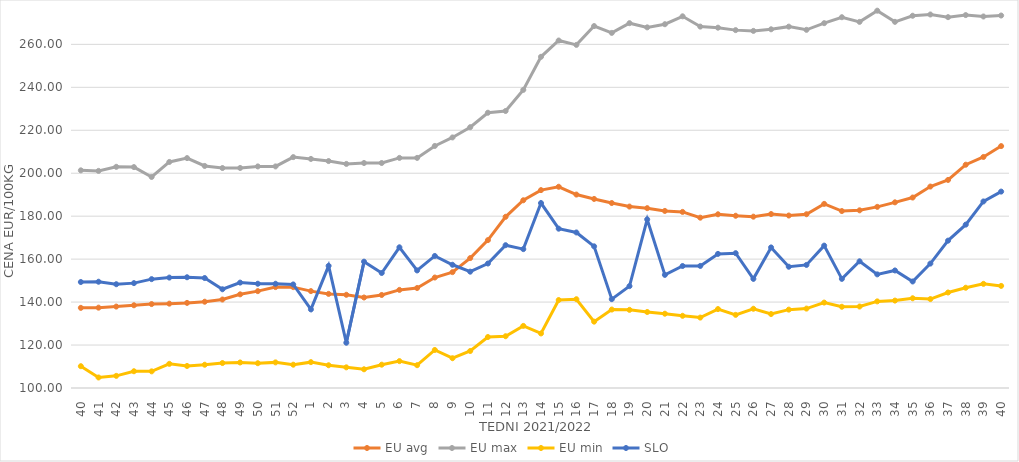
| Category | EU avg | EU max | EU min | SLO |
|---|---|---|---|---|
| 40.0 | 137.315 | 201.34 | 110.15 | 149.34 |
| 41.0 | 137.411 | 201.081 | 104.9 | 149.48 |
| 42.0 | 137.908 | 202.98 | 105.65 | 148.32 |
| 43.0 | 138.52 | 202.856 | 107.8 | 148.83 |
| 44.0 | 139.076 | 198.26 | 107.75 | 150.69 |
| 45.0 | 139.275 | 205.257 | 111.25 | 151.41 |
| 46.0 | 139.626 | 207.046 | 110.26 | 151.56 |
| 47.0 | 140.17 | 203.387 | 110.83 | 151.2 |
| 48.0 | 141.2 | 202.42 | 111.62 | 145.97 |
| 49.0 | 143.614 | 202.45 | 111.89 | 149.07 |
| 50.0 | 145.101 | 203.17 | 111.54 | 148.55 |
| 51.0 | 146.984 | 203.17 | 111.93 | 148.54 |
| 52.0 | 146.958 | 207.5 | 110.85 | 148.22 |
| 1.0 | 145.11 | 206.66 | 112.04 | 136.59 |
| 2.0 | 143.822 | 205.67 | 110.59 | 156.88 |
| 3.0 | 143.402 | 204.34 | 109.62 | 121.07 |
| 4.0 | 142.134 | 204.76 | 108.71 | 158.82 |
| 5.0 | 143.314 | 204.76 | 110.86 | 153.55 |
| 6.0 | 145.677 | 207.14 | 112.52 | 165.51 |
| 7.0 | 146.556 | 207.14 | 110.619 | 154.74 |
| 8.0 | 151.439 | 212.7 | 117.709 | 161.48 |
| 9.0 | 153.947 | 216.67 | 113.871 | 157.38 |
| 10.0 | 160.496 | 221.43 | 117.233 | 154.16 |
| 11.0 | 168.845 | 228.17 | 123.737 | 157.96 |
| 12.0 | 179.714 | 228.97 | 124.105 | 166.49 |
| 13.0 | 187.409 | 238.81 | 128.918 | 164.66 |
| 14.0 | 192.137 | 254.21 | 125.399 | 186.11 |
| 15.0 | 193.697 | 261.79 | 140.954 | 174.18 |
| 16.0 | 190.066 | 259.76 | 141.337 | 172.42 |
| 17.0 | 188.031 | 268.52 | 130.897 | 165.96 |
| 18.0 | 186.119 | 265.34 | 136.529 | 141.36 |
| 19.0 | 184.47 | 269.87 | 136.387 | 147.43 |
| 20.0 | 183.734 | 267.92 | 135.392 | 178.51 |
| 21.0 | 182.45 | 269.38 | 134.589 | 152.67 |
| 22.0 | 181.991 | 273.06 | 133.621 | 156.8 |
| 23.0 | 179.308 | 268.27 | 132.787 | 156.84 |
| 24.0 | 180.886 | 267.77 | 136.75 | 162.44 |
| 25.0 | 180.2 | 266.63 | 134.058 | 162.78 |
| 26.0 | 179.77 | 266.27 | 136.895 | 150.82 |
| 27.0 | 180.992 | 267.02 | 134.44 | 165.45 |
| 28.0 | 180.305 | 268.25 | 136.486 | 156.46 |
| 29.0 | 180.913 | 266.77 | 136.97 | 157.31 |
| 30.0 | 185.728 | 269.87 | 139.777 | 166.29 |
| 31.0 | 182.385 | 272.64 | 137.828 | 150.81 |
| 32.0 | 182.73 | 270.47 | 137.934 | 158.99 |
| 33.0 | 184.343 | 275.68 | 140.33 | 152.91 |
| 34.0 | 186.448 | 270.49 | 140.7 | 154.73 |
| 35.0 | 188.684 | 273.33 | 141.78 | 149.6 |
| 36.0 | 193.792 | 273.91 | 141.41 | 157.93 |
| 37.0 | 196.877 | 272.67 | 144.47 | 168.61 |
| 38.0 | 203.962 | 273.63 | 146.68 | 176.07 |
| 39.0 | 207.572 | 272.98 | 148.499 | 186.86 |
| 40.0 | 212.637 | 273.43 | 147.54 | 191.45 |